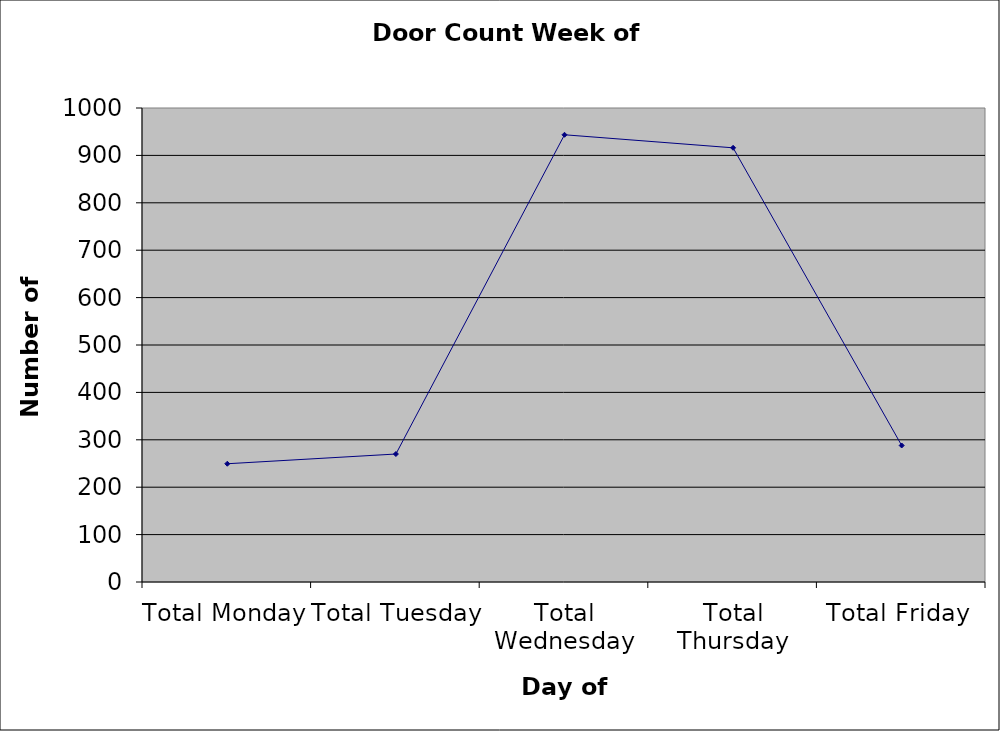
| Category | Series 0 |
|---|---|
| Total Monday | 249.5 |
| Total Tuesday | 270 |
| Total Wednesday | 943.5 |
| Total Thursday | 916 |
| Total Friday | 288 |